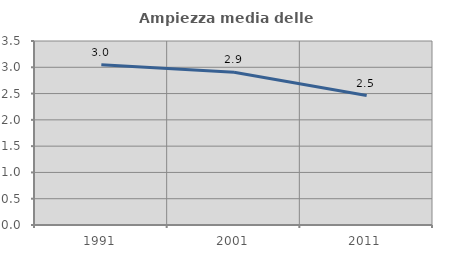
| Category | Ampiezza media delle famiglie |
|---|---|
| 1991.0 | 3.05 |
| 2001.0 | 2.905 |
| 2011.0 | 2.462 |